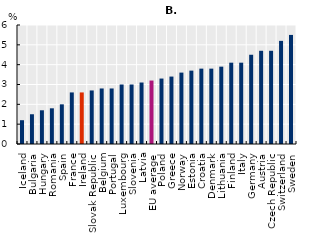
| Category | Construction |
|---|---|
| Iceland | 1.2 |
| Bulgaria | 1.5 |
| Hungary | 1.7 |
| Romania | 1.8 |
| Spain | 2 |
| France | 2.6 |
| Ireland | 2.6 |
| Slovak Republic | 2.7 |
| Belgium | 2.8 |
| Portugal | 2.8 |
| Luxembourg | 3 |
| Slovenia | 3 |
| Latvia | 3.1 |
| EU average | 3.2 |
| Poland | 3.3 |
| Greece | 3.4 |
| Norway | 3.6 |
| Estonia | 3.7 |
| Croatia | 3.8 |
| Denmark | 3.8 |
| Lithuania | 3.9 |
| Finland | 4.1 |
| Italy | 4.1 |
| Germany | 4.5 |
| Austria | 4.7 |
| Czech Republic | 4.7 |
| Switzerland | 5.2 |
| Sweden | 5.5 |